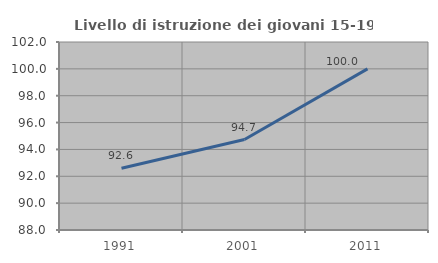
| Category | Livello di istruzione dei giovani 15-19 anni |
|---|---|
| 1991.0 | 92.593 |
| 2001.0 | 94.737 |
| 2011.0 | 100 |